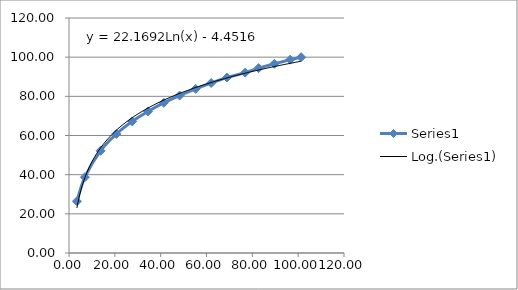
| Category | Series 0 |
|---|---|
| 3.45 | 26.4 |
| 6.9 | 38.7 |
| 13.79 | 52.2 |
| 20.69 | 60.8 |
| 27.58 | 67.2 |
| 34.48 | 72.3 |
| 41.37 | 76.7 |
| 48.27 | 80.4 |
| 55.27 | 83.8 |
| 62.06 | 86.8 |
| 68.95 | 89.6 |
| 76.85 | 92.1 |
| 82.74 | 94.4 |
| 89.64 | 96.6 |
| 96.53 | 98.7 |
| 101.3 | 100 |